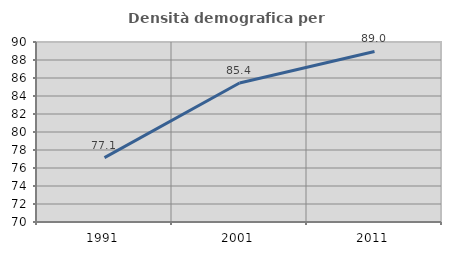
| Category | Densità demografica |
|---|---|
| 1991.0 | 77.149 |
| 2001.0 | 85.438 |
| 2011.0 | 88.95 |